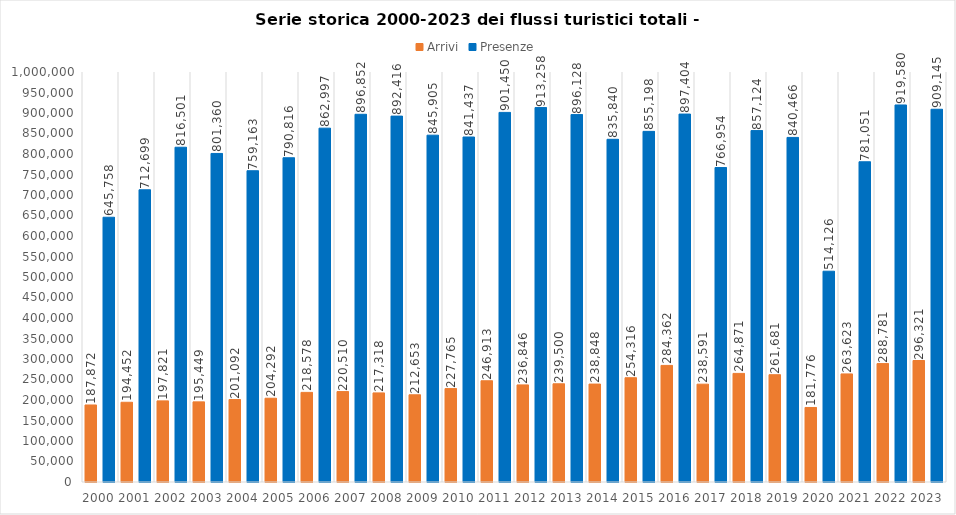
| Category | Arrivi | Presenze |
|---|---|---|
| 2000.0 | 187872 | 645758 |
| 2001.0 | 194452 | 712699 |
| 2002.0 | 197821 | 816501 |
| 2003.0 | 195449 | 801360 |
| 2004.0 | 201092 | 759163 |
| 2005.0 | 204292 | 790816 |
| 2006.0 | 218578 | 862997 |
| 2007.0 | 220510 | 896852 |
| 2008.0 | 217318 | 892416 |
| 2009.0 | 212653 | 845905 |
| 2010.0 | 227765 | 841437 |
| 2011.0 | 246913 | 901450 |
| 2012.0 | 236846 | 913258 |
| 2013.0 | 239500 | 896128 |
| 2014.0 | 238848 | 835840 |
| 2015.0 | 254316 | 855198 |
| 2016.0 | 284362 | 897404 |
| 2017.0 | 238591 | 766954 |
| 2018.0 | 264871 | 857124 |
| 2019.0 | 261681 | 840466 |
| 2020.0 | 181776 | 514126 |
| 2021.0 | 263623 | 781051 |
| 2022.0 | 288781 | 919580 |
| 2023.0 | 296321 | 909145 |